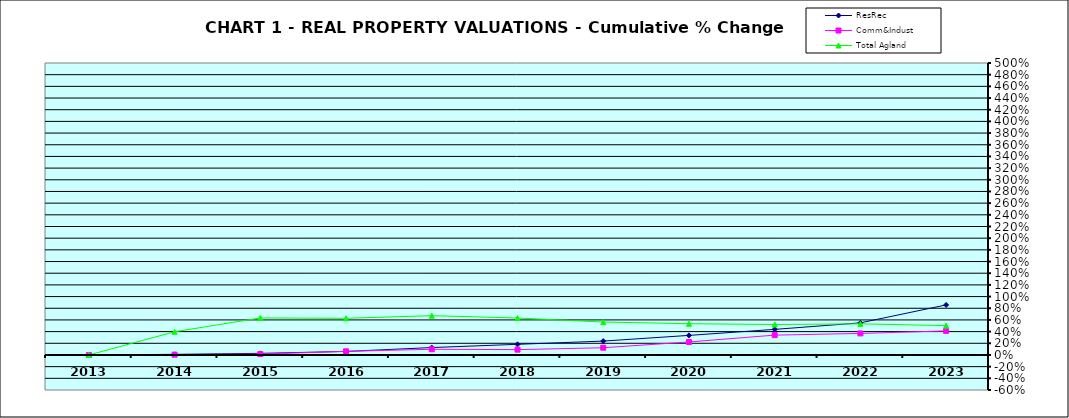
| Category | ResRec | Comm&Indust | Total Agland |
|---|---|---|---|
| 2013.0 | 0 | 0 | 0 |
| 2014.0 | 0.01 | 0.005 | 0.397 |
| 2015.0 | 0.027 | 0.015 | 0.634 |
| 2016.0 | 0.061 | 0.062 | 0.628 |
| 2017.0 | 0.127 | 0.098 | 0.673 |
| 2018.0 | 0.182 | 0.091 | 0.633 |
| 2019.0 | 0.238 | 0.124 | 0.564 |
| 2020.0 | 0.335 | 0.223 | 0.535 |
| 2021.0 | 0.438 | 0.34 | 0.522 |
| 2022.0 | 0.55 | 0.369 | 0.533 |
| 2023.0 | 0.857 | 0.412 | 0.503 |